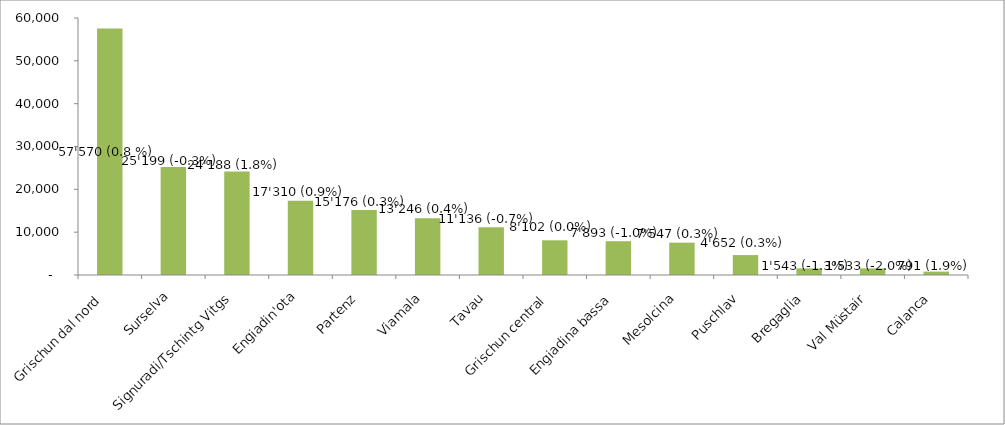
| Category | Series 0 |
|---|---|
| Nordbünden  | 57570 |
| Surselva | 25199 |
| Herrschaft/Fünf Dörfer | 24188 |
| Oberengadin | 17310 |
| Prättigau  | 15176 |
| Viamala  | 13246 |
| Davos  | 11136 |
| Mittelbünden  | 8102 |
| Engiadina Bassa  | 7893 |
| Mesolcina  | 7547 |
| Poschiavo  | 4652 |
| Bregaglia  | 1543 |
| Val Müstair  | 1533 |
| Calanca  | 791 |